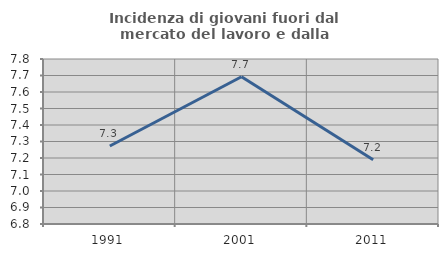
| Category | Incidenza di giovani fuori dal mercato del lavoro e dalla formazione  |
|---|---|
| 1991.0 | 7.273 |
| 2001.0 | 7.692 |
| 2011.0 | 7.19 |